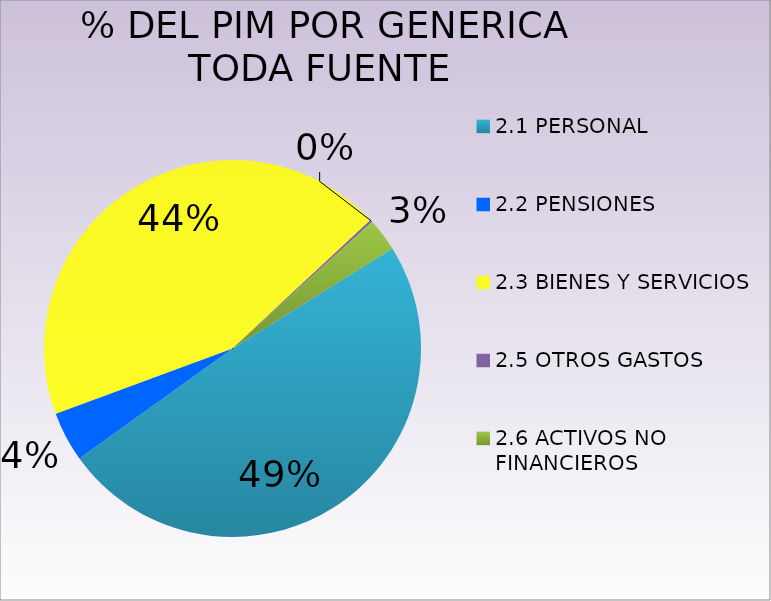
| Category | Series 0 |
|---|---|
| 2.1 PERSONAL | 26927333 |
| 2.2 PENSIONES | 2356422 |
| 2.3 BIENES Y SERVICIOS | 24029762 |
| 2.5 OTROS GASTOS  | 113222 |
| 2.6 ACTIVOS NO FINANCIEROS  | 1560189 |